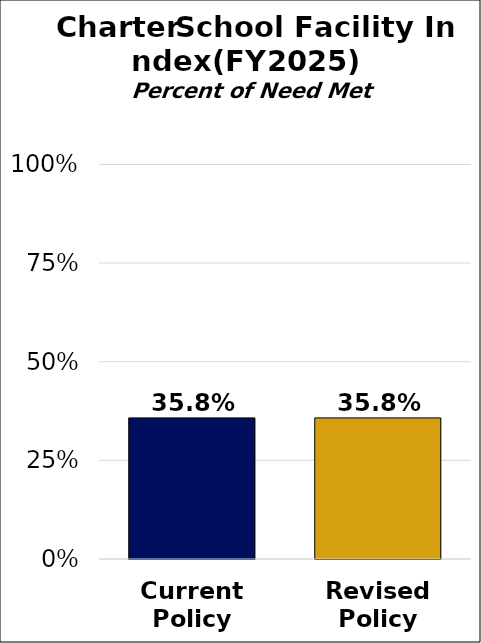
| Category | Total Need Met |
|---|---|
| Current
Policy | 0.358 |
| Revised
Policy | 0.358 |